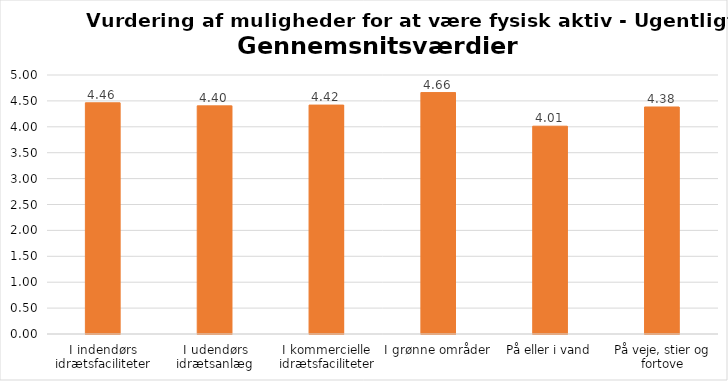
| Category | Gennemsnit |
|---|---|
| I indendørs idrætsfaciliteter | 4.463 |
| I udendørs idrætsanlæg | 4.404 |
| I kommercielle idrætsfaciliteter | 4.419 |
| I grønne områder | 4.661 |
| På eller i vand | 4.012 |
| På veje, stier og fortove | 4.382 |